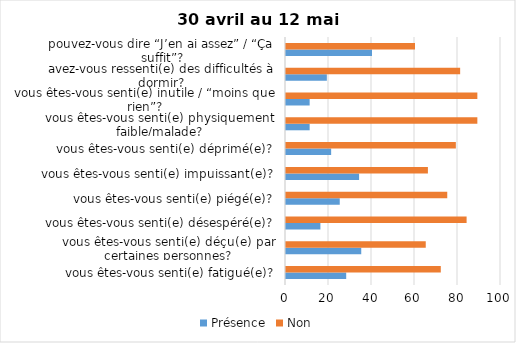
| Category | Présence | Non |
|---|---|---|
| vous êtes-vous senti(e) fatigué(e)? | 28 | 72 |
| vous êtes-vous senti(e) déçu(e) par certaines personnes? | 35 | 65 |
| vous êtes-vous senti(e) désespéré(e)? | 16 | 84 |
| vous êtes-vous senti(e) piégé(e)? | 25 | 75 |
| vous êtes-vous senti(e) impuissant(e)? | 34 | 66 |
| vous êtes-vous senti(e) déprimé(e)? | 21 | 79 |
| vous êtes-vous senti(e) physiquement faible/malade? | 11 | 89 |
| vous êtes-vous senti(e) inutile / “moins que rien”? | 11 | 89 |
| avez-vous ressenti(e) des difficultés à dormir? | 19 | 81 |
| pouvez-vous dire “J’en ai assez” / “Ça suffit”? | 40 | 60 |